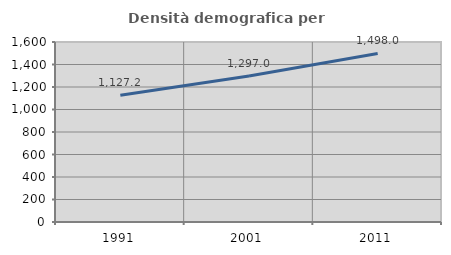
| Category | Densità demografica |
|---|---|
| 1991.0 | 1127.188 |
| 2001.0 | 1296.989 |
| 2011.0 | 1498.04 |